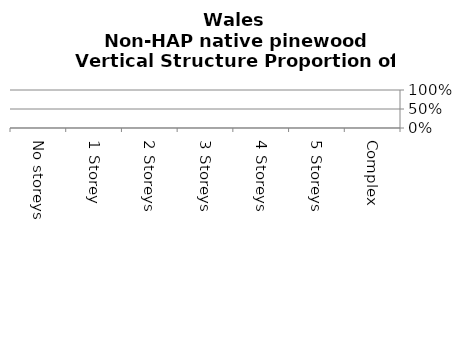
| Category | Non-HAP native pinewood |
|---|---|
| No storeys | 0 |
| 1 Storey | 0 |
| 2 Storeys | 0 |
| 3 Storeys | 0 |
| 4 Storeys | 0 |
| 5 Storeys | 0 |
| Complex | 0 |